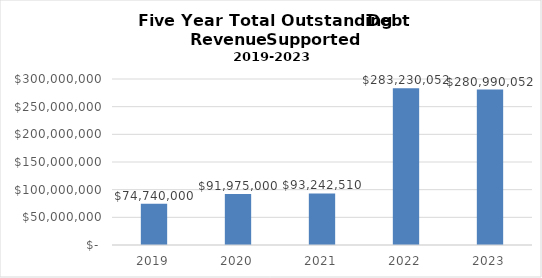
| Category | Series 0 |
|---|---|
| 2019.0 | 74740000 |
| 2020.0 | 91975000 |
| 2021.0 | 93242510 |
| 2022.0 | 283230052 |
| 2023.0 | 280990052 |